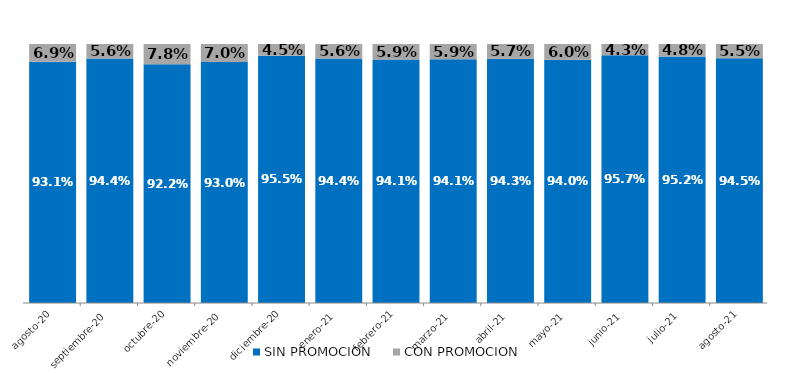
| Category | SIN PROMOCION   | CON PROMOCION   |
|---|---|---|
| 2020-08-01 | 0.931 | 0.069 |
| 2020-09-01 | 0.944 | 0.056 |
| 2020-10-01 | 0.922 | 0.078 |
| 2020-11-01 | 0.93 | 0.07 |
| 2020-12-01 | 0.955 | 0.045 |
| 2021-01-01 | 0.944 | 0.056 |
| 2021-02-01 | 0.941 | 0.059 |
| 2021-03-01 | 0.941 | 0.059 |
| 2021-04-01 | 0.943 | 0.057 |
| 2021-05-01 | 0.94 | 0.06 |
| 2021-06-01 | 0.957 | 0.043 |
| 2021-07-01 | 0.952 | 0.048 |
| 2021-08-01 | 0.945 | 0.055 |